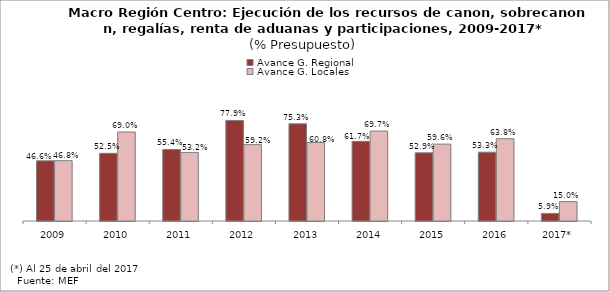
| Category | Avance G. Regional | Avance G. Locales |
|---|---|---|
| 2009 | 0.466 | 0.468 |
| 2010 | 0.525 | 0.69 |
| 2011 | 0.554 | 0.532 |
| 2012 | 0.779 | 0.592 |
| 2013 | 0.753 | 0.608 |
| 2014 | 0.617 | 0.697 |
| 2015 | 0.529 | 0.596 |
| 2016 | 0.533 | 0.638 |
| 2017* | 0.059 | 0.15 |